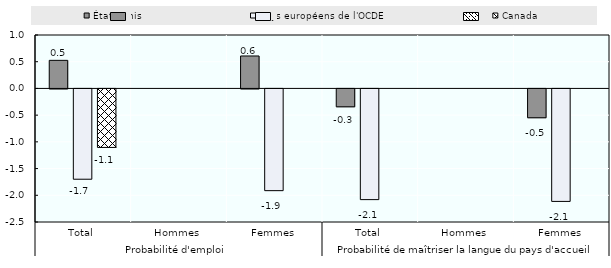
| Category | États-Unis | Pays européens de l'OCDE | Canada |
|---|---|---|---|
| 0 | 0.526 | -1.69 | -1.095 |
| 1 | 0 | 0 | 0 |
| 2 | 0.607 | -1.904 | 0 |
| 3 | -0.335 | -2.072 | 0 |
| 4 | 0 | 0 | 0 |
| 5 | -0.54 | -2.105 | 0 |